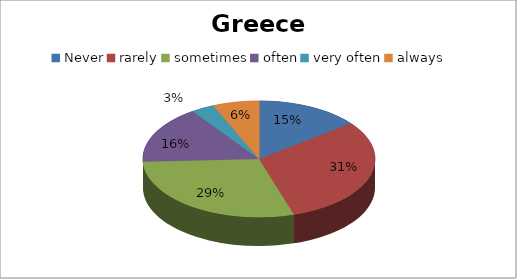
| Category | Series 0 |
|---|---|
| Never | 9 |
| rarely | 19 |
| sometimes | 18 |
| often | 10 |
| very often | 2 |
| always | 4 |